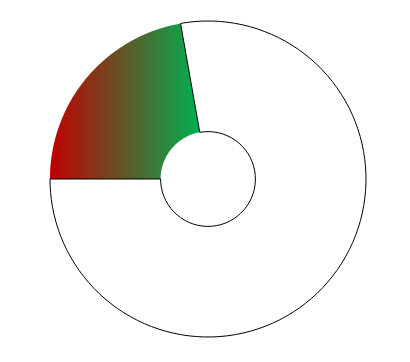
| Category | Series 0 |
|---|---|
| 0 | 80 |
| 1 | 280 |